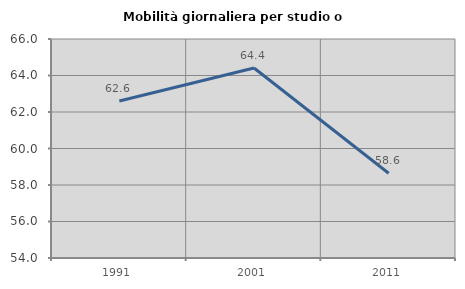
| Category | Mobilità giornaliera per studio o lavoro |
|---|---|
| 1991.0 | 62.602 |
| 2001.0 | 64.413 |
| 2011.0 | 58.647 |